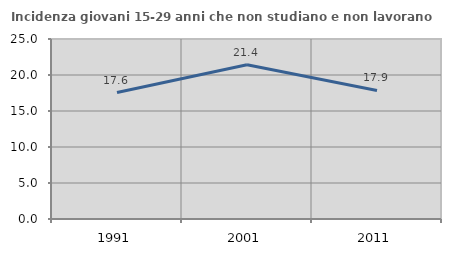
| Category | Incidenza giovani 15-29 anni che non studiano e non lavorano  |
|---|---|
| 1991.0 | 17.56 |
| 2001.0 | 21.429 |
| 2011.0 | 17.857 |